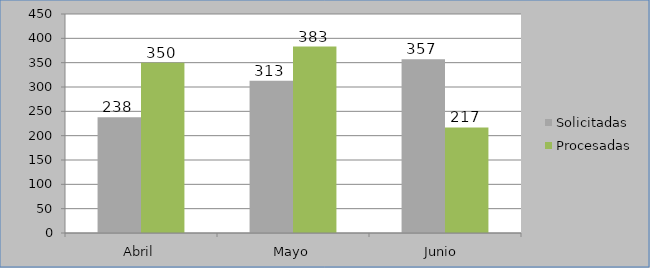
| Category | Solicitadas | Procesadas |
|---|---|---|
| Abril | 238 | 350 |
| Mayo | 313 | 383 |
| Junio  | 357 | 217 |